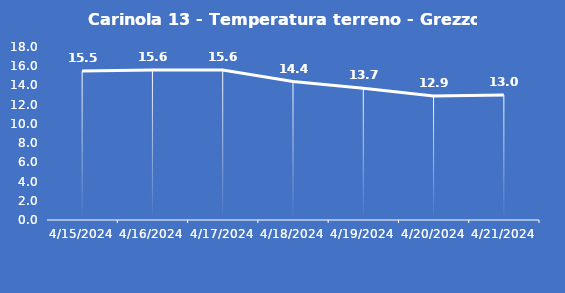
| Category | Carinola 13 - Temperatura terreno - Grezzo (°C) |
|---|---|
| 4/15/24 | 15.5 |
| 4/16/24 | 15.6 |
| 4/17/24 | 15.6 |
| 4/18/24 | 14.4 |
| 4/19/24 | 13.7 |
| 4/20/24 | 12.9 |
| 4/21/24 | 13 |